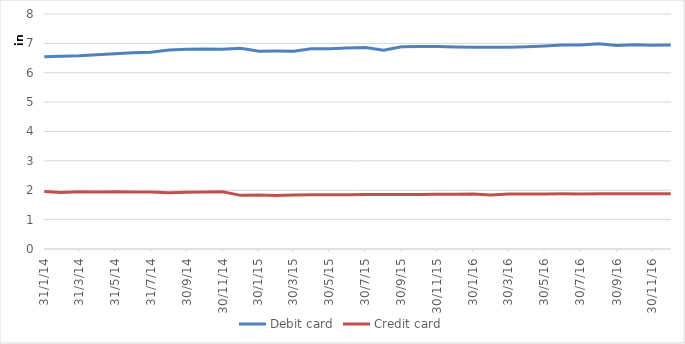
| Category | Debit card | Credit card |
|---|---|---|
| 2014-01-31 | 6546779 | 1954442 |
| 2014-02-28 | 6562690 | 1925820 |
| 2014-03-31 | 6581337 | 1949036 |
| 2014-04-30 | 6614659 | 1940028 |
| 2014-05-31 | 6648039 | 1949860 |
| 2014-06-30 | 6677480 | 1939820 |
| 2014-07-31 | 6697820 | 1939238 |
| 2014-08-31 | 6775834 | 1915865 |
| 2014-09-30 | 6802670 | 1929466 |
| 2014-10-31 | 6811219 | 1942283 |
| 2014-11-30 | 6797564 | 1947964 |
| 2014-12-31 | 6834248 | 1825782 |
| 2015-01-31 | 6733597 | 1836987 |
| 2015-02-28 | 6737309 | 1824482 |
| 2015-03-31 | 6730158 | 1834314 |
| 2015-04-30 | 6813148 | 1843046 |
| 2015-05-31 | 6820338 | 1845782 |
| 2015-06-30 | 6842683 | 1850337 |
| 2015-07-31 | 6860978 | 1852757 |
| 2015-08-31 | 6769502 | 1855233 |
| 2015-09-30 | 6881455 | 1854320 |
| 2015-10-31 | 6896769 | 1857929 |
| 2015-11-30 | 6895068 | 1861024 |
| 2015-12-31 | 6879381 | 1859612 |
| 2016-01-31 | 6871715 | 1870448 |
| 2016-02-29 | 6863998 | 1839395 |
| 2016-03-31 | 6868674 | 1872768 |
| 2016-04-30 | 6881735 | 1874715 |
| 2016-05-31 | 6906936 | 1873945 |
| 2016-06-30 | 6943474 | 1878621 |
| 2016-07-31 | 6945024 | 1872211 |
| 2016-08-31 | 6988808 | 1878626 |
| 2016-09-30 | 6931731 | 1879552 |
| 2016-10-31 | 6951022 | 1878009 |
| 2016-11-30 | 6935749 | 1883222 |
| 2016-12-31 | 6944246 | 1878574 |